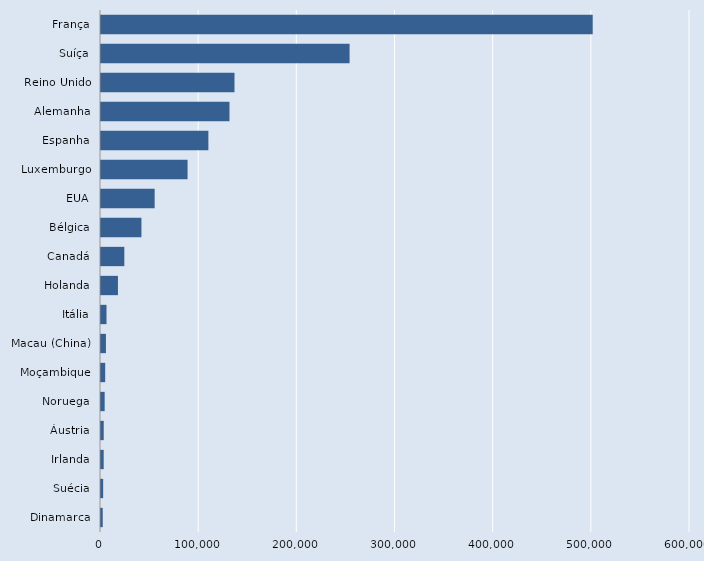
| Category | Series 0 |
|---|---|
| Dinamarca | 1768 |
| Suécia | 2193 |
| Irlanda | 2739 |
| Áustria | 2775 |
| Noruega | 3731 |
| Moçambique | 4279 |
| Macau (China) | 5020 |
| Itália | 5614 |
| Holanda | 17266 |
| Canadá | 23765 |
| Bélgica | 41200 |
| EUA | 54669 |
| Luxemburgo | 88200 |
| Espanha | 109390 |
| Alemanha | 130882 |
| Reino Unido | 136000 |
| Suíça | 253227 |
| França | 500891 |